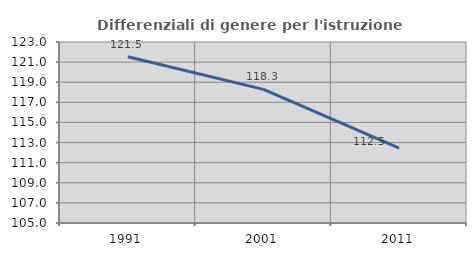
| Category | Differenziali di genere per l'istruzione superiore |
|---|---|
| 1991.0 | 121.527 |
| 2001.0 | 118.292 |
| 2011.0 | 112.454 |